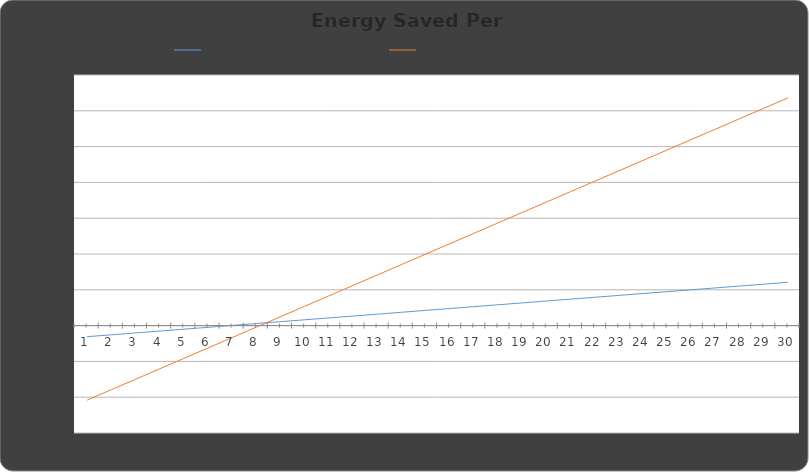
| Category | Savings  vs Paper Cup (kWh) | Amount of hours of LCD TV equivalent |
|---|---|---|
| 0 | -1.548 | -10.41 |
| 1 | -1.286 | -8.954 |
| 2 | -1.024 | -7.499 |
| 3 | -0.762 | -6.043 |
| 4 | -0.5 | -4.588 |
| 5 | -0.238 | -3.132 |
| 6 | 0.024 | -1.677 |
| 7 | 0.286 | -0.221 |
| 8 | 0.548 | 1.234 |
| 9 | 0.81 | 2.69 |
| 10 | 1.072 | 4.146 |
| 11 | 1.334 | 5.601 |
| 12 | 1.596 | 7.057 |
| 13 | 1.858 | 8.512 |
| 14 | 2.12 | 9.968 |
| 15 | 2.382 | 11.423 |
| 16 | 2.644 | 12.879 |
| 17 | 2.906 | 14.334 |
| 18 | 3.168 | 15.79 |
| 19 | 3.43 | 17.246 |
| 20 | 3.692 | 18.701 |
| 21 | 3.954 | 20.157 |
| 22 | 4.216 | 21.612 |
| 23 | 4.478 | 23.068 |
| 24 | 4.74 | 24.523 |
| 25 | 5.002 | 25.979 |
| 26 | 5.264 | 27.434 |
| 27 | 5.526 | 28.89 |
| 28 | 5.788 | 30.346 |
| 29 | 6.05 | 31.801 |